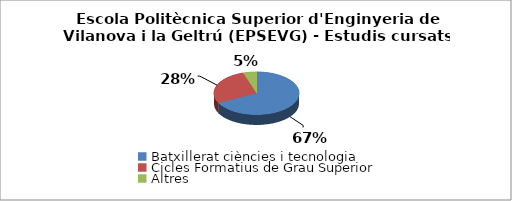
| Category | Escola Politècnica Superior d'Enginyeria de Vilanova i la Geltrú (EPSEVG) - Estudis cursats |
|---|---|
| Batxillerat ciències i tecnologia | 0.673 |
| Cicles Formatius de Grau Superior | 0.276 |
| Altres | 0.05 |